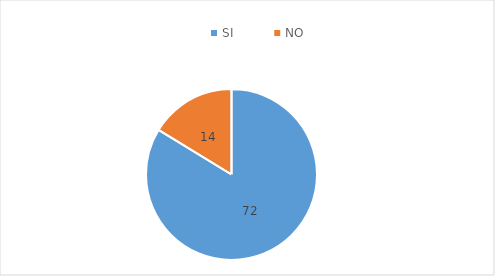
| Category | Series 0 |
|---|---|
| SI | 72 |
| NO | 14 |